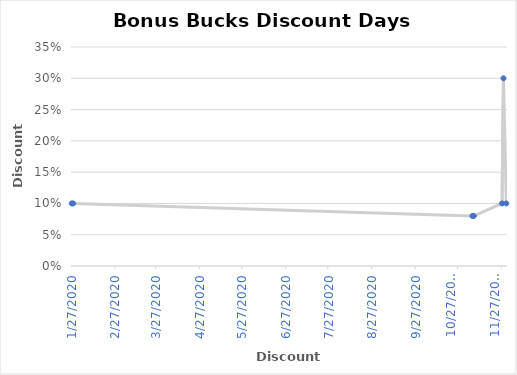
| Category | Discount |
|---|---|
| 11/30/20 | 0.1 |
| 11/28/20 | 0.3 |
| 11/27/20 | 0.1 |
| 11/7/20 | 0.08 |
| 11/6/20 | 0.08 |
| 1/28/20 | 0.1 |
| 1/27/20 | 0.1 |